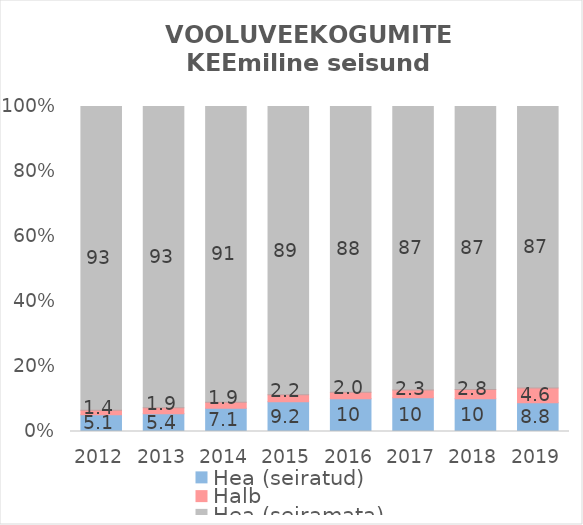
| Category | Hea (seiratud) | Halb | Hea (seiramata) |
|---|---|---|---|
| 2012.0 | 5.124 | 1.398 | 93.478 |
| 2013.0 | 5.435 | 1.863 | 92.702 |
| 2014.0 | 7.143 | 1.863 | 90.994 |
| 2015.0 | 9.161 | 2.174 | 88.665 |
| 2016.0 | 10.093 | 2.019 | 87.888 |
| 2017.0 | 10.404 | 2.329 | 87.267 |
| 2018.0 | 10.093 | 2.795 | 87.112 |
| 2019.0 | 8.819 | 4.567 | 86.614 |